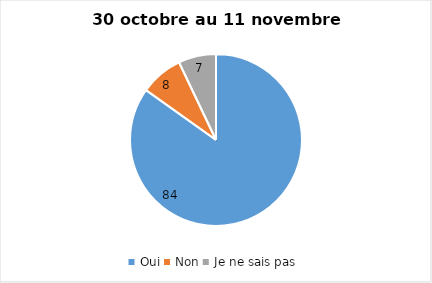
| Category | Series 0 |
|---|---|
| Oui | 84 |
| Non | 8 |
| Je ne sais pas | 7 |